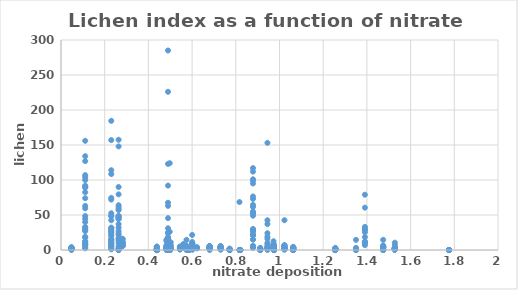
| Category | Lichen index as a function of sulfate deposition |
|---|---|
| 0.282 | 10 |
| 0.282 | 8 |
| 0.282 | 9.5 |
| 0.282 | 15.5 |
| 0.282 | 16 |
| 0.282 | 9 |
| 0.282 | 6 |
| 0.282 | 5.5 |
| 0.282 | 6.5 |
| 0.282 | 6 |
| 0.282 | 12.5 |
| 0.282 | 11 |
| 0.11075 | 30 |
| 0.11075 | 134 |
| 0.11075 | 156 |
| 0.11075 | 5 |
| 0.11075 | 32 |
| 0.11075 | 100 |
| 0.11075 | 107 |
| 0.11075 | 59.5 |
| 0.11075 | 92 |
| 0.11075 | 17.5 |
| 0.11075 | 63 |
| 0.11075 | 104 |
| 0.11075 | 44.5 |
| 0.11075 | 8.5 |
| 0.11075 | 48.5 |
| 0.11075 | 9.5 |
| 0.11075 | 12.5 |
| 0.11075 | 8 |
| 0.11075 | 89 |
| 0.11075 | 12 |
| 0.11075 | 82.5 |
| 0.11075 | 74 |
| 0.11075 | 40 |
| 0.11075 | 7.5 |
| 0.11075 | 19 |
| 0.11075 | 27 |
| 0.11075 | 2.5 |
| 0.11075 | 33 |
| 0.11075 | 3 |
| 0.11075 | 90 |
| 0.11075 | 28 |
| 0.11075 | 90.5 |
| 0.11075 | 127 |
| 0.4977 | 10 |
| 0.4977 | 3.5 |
| 0.4977 | 5 |
| 0.4977 | 0 |
| 0.4977 | 1 |
| 0.4977 | 10.5 |
| 0.4977 | 5.5 |
| 0.4977 | 124 |
| 0.4977 | 3 |
| 0.4977 | 3 |
| 0.4977 | 0 |
| 0.4977 | 26 |
| 0.4977 | 1.5 |
| 0.4977 | 1.5 |
| 0.0478 | 1.5 |
| 0.0478 | 3.5 |
| 0.0478 | 1 |
| 0.0478 | 3 |
| 0.0478 | 0.5 |
| 0.0478 | 0.5 |
| 0.0478 | 3 |
| 0.0478 | 3 |
| 0.0478 | 4 |
| 0.0478 | 2 |
| 0.0478 | 1.5 |
| 0.0478 | 1.5 |
| 0.0478 | 2.5 |
| 0.0478 | 3 |
| 0.0478 | 0.5 |
| 0.0478 | 2.5 |
| 0.0478 | 3 |
| 0.23 | 32 |
| 0.23 | 11 |
| 0.23 | 6 |
| 0.23 | 28 |
| 0.23 | 13 |
| 0.23 | 5 |
| 0.23 | 20 |
| 0.23 | 31 |
| 0.23 | 25 |
| 0.23 | 27 |
| 0.23 | 1 |
| 0.23 | 3.5 |
| 0.23 | 8 |
| 0.23 | 48 |
| 0.23 | 31 |
| 0.23 | 72 |
| 0.23 | 157 |
| 0.23 | 21.5 |
| 0.23 | 15 |
| 0.23 | 49 |
| 0.23 | 42.5 |
| 0.23 | 184.5 |
| 0.23 | 2 |
| 0.23 | 14 |
| 0.23 | 74.5 |
| 0.23 | 10.5 |
| 0.23 | 16 |
| 0.23 | 52.5 |
| 0.23 | 108.5 |
| 0.23 | 7 |
| 0.23 | 8.5 |
| 0.23 | 24.5 |
| 0.23 | 114 |
| 0.5024 | 3 |
| 0.5024 | 2.5 |
| 0.5024 | 2.5 |
| 0.5024 | 3.5 |
| 0.5024 | 11 |
| 0.5024 | 3 |
| 0.5024 | 6.5 |
| 0.73042 | 3 |
| 0.73042 | 3.5 |
| 0.73042 | 3 |
| 0.73042 | 2.5 |
| 0.73042 | 3 |
| 0.73042 | 3.5 |
| 0.73042 | 3 |
| 0.73042 | 3 |
| 0.73042 | 3 |
| 0.73042 | 3.5 |
| 0.73042 | 5.5 |
| 0.73042 | 2.5 |
| 0.73042 | 0.5 |
| 0.73042 | 4.5 |
| 0.73042 | 5.5 |
| 0.73042 | 2 |
| 0.73042 | 1 |
| 0.73042 | 3 |
| 0.58375 | 0 |
| 0.58375 | 0 |
| 0.58375 | 0 |
| 0.58375 | 0 |
| 0.58375 | 0 |
| 0.58375 | 0 |
| 0.58375 | 0 |
| 0.58375 | 0 |
| 0.58375 | 0 |
| 0.58375 | 0 |
| 0.58375 | 0 |
| 0.58375 | 0 |
| 0.58375 | 0 |
| 0.58375 | 0 |
| 0.58375 | 0 |
| 0.58375 | 0 |
| 0.58375 | 0 |
| 0.58375 | 0 |
| 0.58375 | 0 |
| 0.58375 | 0 |
| 0.58375 | 0 |
| 0.58375 | 0 |
| 0.58375 | 0 |
| 0.58375 | 0 |
| 0.58375 | 0 |
| 0.58375 | 0 |
| 0.58375 | 0 |
| 0.58375 | 0 |
| 0.58375 | 0 |
| 0.58375 | 0 |
| 0.58375 | 0 |
| 0.58375 | 0 |
| 0.58375 | 0.5 |
| 0.6017 | 2 |
| 0.6017 | 3 |
| 0.6017 | 2.5 |
| 0.6017 | 2.5 |
| 0.6017 | 3 |
| 0.6017 | 6 |
| 0.6017 | 3 |
| 0.6017 | 0.5 |
| 0.6017 | 2 |
| 0.6017 | 3 |
| 0.6017 | 4 |
| 0.6017 | 1.5 |
| 0.6017 | 5 |
| 0.6017 | 1.5 |
| 0.6017 | 3 |
| 0.6017 | 4 |
| 0.6017 | 3.5 |
| 0.6017 | 7 |
| 0.6017 | 2 |
| 0.6017 | 2.5 |
| 0.6017 | 2 |
| 0.6017 | 1 |
| 0.6017 | 3.5 |
| 0.6017 | 5 |
| 0.6017 | 2 |
| 0.6017 | 6 |
| 0.6017 | 9.5 |
| 0.4882 | 2 |
| 0.4882 | 4 |
| 0.4882 | 1.5 |
| 0.4882 | 1.5 |
| 0.4882 | 2 |
| 0.4882 | 1.5 |
| 0.4882 | 2.5 |
| 0.4882 | 3 |
| 0.4882 | 1.5 |
| 0.4882 | 2.5 |
| 0.4882 | 4 |
| 0.4882 | 2.5 |
| 0.4882 | 1.5 |
| 0.4882 | 2.5 |
| 0.4882 | 1.5 |
| 0.4882 | 4 |
| 0.4882 | 1.5 |
| 0.4882 | 0.5 |
| 0.4882 | 1.5 |
| 0.4882 | 3 |
| 0.4882 | 2.5 |
| 0.4882 | 2.5 |
| 0.4882 | 3 |
| 0.4882 | 1.5 |
| 0.4882 | 3 |
| 0.4882 | 0 |
| 0.4882 | 2 |
| 0.4882 | 1.5 |
| 0.4882 | 2.5 |
| 0.4882 | 2 |
| 0.4882 | 2 |
| 0.4882 | 1.5 |
| 0.4882 | 6.5 |
| 0.6224 | 3 |
| 0.6224 | 2.5 |
| 0.6224 | 2.5 |
| 0.6224 | 3 |
| 0.6224 | 3.5 |
| 0.6224 | 3 |
| 0.6224 | 3 |
| 0.6224 | 4 |
| 0.56 | 4.5 |
| 0.56 | 3.5 |
| 0.56 | 3.5 |
| 0.56 | 7 |
| 0.56 | 4.5 |
| 0.56 | 3 |
| 0.56 | 3 |
| 0.56 | 3.5 |
| 0.56 | 5 |
| 0.56 | 8.5 |
| 0.56 | 3 |
| 0.56 | 4 |
| 0.56 | 4 |
| 0.8787 | 73 |
| 0.8787 | 95 |
| 0.8787 | 29 |
| 0.8787 | 99 |
| 0.8787 | 117 |
| 0.8787 | 27 |
| 0.8787 | 55 |
| 0.8787 | 6 |
| 0.8787 | 21 |
| 0.8787 | 112 |
| 0.8787 | 29 |
| 0.8787 | 50.5 |
| 0.8787 | 64.5 |
| 0.8787 | 53 |
| 0.8787 | 76.5 |
| 0.8787 | 53.5 |
| 0.8787 | 15 |
| 0.8787 | 30 |
| 0.8787 | 101 |
| 0.8787 | 23 |
| 0.8787 | 27 |
| 0.8787 | 15 |
| 0.8787 | 61.5 |
| 0.8787 | 49 |
| 0.8787 | 29 |
| 0.8787 | 20.5 |
| 0.8787 | 3 |
| 0.8787 | 5 |
| 0.8787 | 5 |
| 0.94475 | 0 |
| 0.94475 | 37 |
| 0.94475 | 2 |
| 0.94475 | 8 |
| 0.94475 | 3 |
| 0.94475 | 2.5 |
| 0.94475 | 4 |
| 0.94475 | 42.5 |
| 0.94475 | 19 |
| 0.94475 | 4 |
| 0.94475 | 5.5 |
| 0.94475 | 16 |
| 0.94475 | 153 |
| 0.94475 | 24 |
| 0.94475 | 10 |
| 0.6002 | 5.5 |
| 0.6002 | 7 |
| 0.6002 | 3.5 |
| 0.6002 | 4 |
| 0.6002 | 4 |
| 0.6002 | 5.5 |
| 0.6002 | 21.5 |
| 0.6002 | 3 |
| 0.6002 | 6 |
| 0.6002 | 4.5 |
| 0.6002 | 9 |
| 0.6002 | 3 |
| 0.6002 | 2.5 |
| 0.6002 | 11.5 |
| 0.6002 | 6.5 |
| 0.6002 | 2.5 |
| 0.6002 | 4 |
| 0.6002 | 3 |
| 0.6002 | 4 |
| 0.6002 | 3 |
| 0.6002 | 4.5 |
| 0.972667 | 4 |
| 0.972667 | 3.5 |
| 0.972667 | 4.5 |
| 0.972667 | 2 |
| 0.972667 | 2 |
| 0.972667 | 3 |
| 0.972667 | 3.5 |
| 0.972667 | 1.5 |
| 0.972667 | 8 |
| 0.972667 | 1.5 |
| 0.972667 | 1.5 |
| 0.972667 | 3.5 |
| 0.972667 | 12.5 |
| 0.972667 | 3 |
| 0.972667 | 6.5 |
| 0.972667 | 3 |
| 0.972667 | 4.5 |
| 0.972667 | 6.5 |
| 0.972667 | 1 |
| 0.972667 | 5 |
| 0.972667 | 2 |
| 0.972667 | 3 |
| 0.972667 | 2.5 |
| 0.972667 | 3 |
| 0.972667 | 2.5 |
| 0.972667 | 2.5 |
| 0.972667 | 3.5 |
| 0.972667 | 3.5 |
| 0.972667 | 1 |
| 0.972667 | 3 |
| 0.7717 | 0 |
| 0.7717 | 0.5 |
| 0.7717 | 1 |
| 0.7717 | 0 |
| 0.7717 | 0 |
| 0.7717 | 0 |
| 0.7717 | 1.5 |
| 0.7717 | 2 |
| 0.7717 | 0 |
| 0.7717 | 0 |
| 0.7717 | 0.5 |
| 0.7717 | 0 |
| 0.7717 | 0 |
| 0.7717 | 1.5 |
| 0.7717 | 0 |
| 0.7717 | 0 |
| 0.57418 | 0 |
| 0.57418 | 1.5 |
| 0.57418 | 0.5 |
| 0.57418 | 2 |
| 0.57418 | 2.5 |
| 0.57418 | 1.5 |
| 0.57418 | 6.5 |
| 0.57418 | 14.5 |
| 0.57418 | 4 |
| 0.57418 | 3 |
| 0.5004 | 1 |
| 0.5004 | 3 |
| 0.5004 | 3 |
| 0.5004 | 2 |
| 0.5004 | 2.5 |
| 0.5004 | 1.5 |
| 0.5004 | 1.5 |
| 0.5004 | 1.5 |
| 0.5004 | 3 |
| 0.5004 | 7.5 |
| 0.5004 | 2 |
| 0.5004 | 1.5 |
| 0.5004 | 2.5 |
| 0.5004 | 3.5 |
| 0.5004 | 2 |
| 0.5004 | 0 |
| 0.5004 | 2.5 |
| 0.5004 | 2 |
| 0.5004 | 2 |
| 0.5004 | 2.5 |
| 0.5004 | 2 |
| 0.5004 | 1 |
| 0.5004 | 2 |
| 0.5004 | 2.5 |
| 0.5004 | 2 |
| 0.5004 | 1.5 |
| 0.5004 | 2.5 |
| 0.5004 | 1.5 |
| 0.5004 | 1.5 |
| 0.5004 | 1.5 |
| 0.5004 | 4 |
| 0.5004 | 2 |
| 0.5004 | 3 |
| 0.4898 | 8 |
| 0.4898 | 4.5 |
| 0.4898 | 18.5 |
| 0.4898 | 67.5 |
| 0.4898 | 5 |
| 0.4898 | 226 |
| 0.4898 | 5 |
| 0.4898 | 3.5 |
| 0.4898 | 3 |
| 0.4898 | 1.5 |
| 0.4898 | 16 |
| 0.4898 | 8 |
| 0.4898 | 9 |
| 0.4898 | 16.5 |
| 0.4898 | 2.5 |
| 0.4898 | 31 |
| 0.4898 | 4 |
| 0.4898 | 12.5 |
| 0.4898 | 123 |
| 0.4898 | 63 |
| 0.4898 | 4 |
| 0.4898 | 10 |
| 0.4898 | 24 |
| 0.4898 | 15.5 |
| 0.4898 | 3 |
| 0.4898 | 10.5 |
| 0.4898 | 3.5 |
| 0.4898 | 11.5 |
| 0.4898 | 45.5 |
| 0.4898 | 285 |
| 0.4898 | 25 |
| 0.4898 | 16.5 |
| 0.4898 | 92 |
| 0.5446 | 1.5 |
| 0.5446 | 3.5 |
| 0.5446 | 1 |
| 0.5446 | 3 |
| 0.5446 | 3.5 |
| 0.5446 | 2.5 |
| 0.5446 | 2 |
| 0.5446 | 4 |
| 0.5446 | 3 |
| 0.5446 | 2 |
| 0.5446 | 1 |
| 0.5446 | 2 |
| 0.5446 | 5 |
| 0.5446 | 3.5 |
| 0.5446 | 1 |
| 0.5446 | 1 |
| 0.5446 | 2.5 |
| 0.5446 | 4 |
| 0.5446 | 1.5 |
| 0.5446 | 4 |
| 0.5446 | 4.5 |
| 0.5446 | 4 |
| 0.4832 | 5.5 |
| 0.4832 | 2 |
| 0.4832 | 5 |
| 0.4832 | 3 |
| 0.4832 | 4.5 |
| 0.4832 | 1 |
| 0.4832 | 1.5 |
| 0.4832 | 3 |
| 0.4832 | 4 |
| 0.4832 | 12.5 |
| 0.4832 | 6 |
| 0.4832 | 3 |
| 0.4832 | 1.5 |
| 0.4832 | 5 |
| 0.4832 | 7 |
| 0.4832 | 15 |
| 0.4832 | 0.5 |
| 0.4832 | 2 |
| 0.4832 | 3 |
| 0.4832 | 14 |
| 0.4832 | 3.5 |
| 0.4832 | 0.5 |
| 0.4832 | 0 |
| 0.821 | 0 |
| 0.821 | 0 |
| 0.821 | 0 |
| 0.821 | 0 |
| 0.821 | 0 |
| 0.821 | 0 |
| 0.821 | 0 |
| 0.821 | 0 |
| 0.821 | 0 |
| 0.821 | 0 |
| 0.821 | 0 |
| 0.821 | 0 |
| 0.821 | 0 |
| 0.9116 | 1.5 |
| 0.9116 | 1 |
| 0.9116 | 1 |
| 0.9116 | 1.5 |
| 0.9116 | 0 |
| 0.9116 | 1 |
| 0.9116 | 0.5 |
| 0.9116 | 0 |
| 0.9116 | 0 |
| 0.9116 | 0.5 |
| 0.9116 | 2 |
| 0.9116 | 0.5 |
| 0.9116 | 1.5 |
| 0.9116 | 1.5 |
| 0.9116 | 2.5 |
| 0.9116 | 0.5 |
| 0.9116 | 0.5 |
| 0.9116 | 3 |
| 0.9116 | 2.5 |
| 0.8169 | 0 |
| 0.8169 | 0 |
| 0.8169 | 0 |
| 0.8169 | 0 |
| 0.8169 | 68.5 |
| 0.8169 | 0 |
| 0.8169 | 0 |
| 0.8169 | 0 |
| 0.8169 | 0 |
| 0.8169 | 0 |
| 0.8169 | 0 |
| 0.8169 | 0 |
| 0.8169 | 0 |
| 1.0227 | 7 |
| 1.0227 | 42.5 |
| 1.0227 | 2.5 |
| 1.0227 | 6.5 |
| 1.0227 | 3.5 |
| 1.0227 | 2.5 |
| 1.0227 | 6 |
| 1.0227 | 3.5 |
| 1.0227 | 5 |
| 1.0227 | 1 |
| 1.0227 | 1 |
| 1.0227 | 4 |
| 1.0227 | 2 |
| 1.0227 | 3 |
| 1.0227 | 1.5 |
| 1.0227 | 0.5 |
| 1.0227 | 4 |
| 1.0227 | 2.5 |
| 1.0626 | 3 |
| 1.0626 | 3 |
| 1.0626 | 3 |
| 1.0626 | 2 |
| 1.0626 | 1.5 |
| 1.0626 | 4 |
| 1.0626 | 1.5 |
| 1.0626 | 1 |
| 1.0626 | 4.5 |
| 1.0626 | 3 |
| 1.0626 | 3 |
| 1.0626 | 2.5 |
| 1.0626 | 1 |
| 1.0626 | 2 |
| 1.0626 | 1.5 |
| 1.0626 | 0 |
| 1.0626 | 2.5 |
| 1.0626 | 3 |
| 1.0626 | 2.5 |
| 1.0626 | 3.5 |
| 1.0626 | 0 |
| 1.0626 | 0 |
| 1.0626 | 0 |
| 1.0626 | 0 |
| 1.0626 | 0 |
| 1.0626 | 0 |
| 1.0626 | 3.5 |
| 1.0626 | 2.5 |
| 1.0626 | 1.5 |
| 1.3909 | 10.5 |
| 1.3909 | 7 |
| 1.3909 | 18.5 |
| 1.3909 | 30 |
| 1.3909 | 11.5 |
| 1.3909 | 28.5 |
| 1.3909 | 79 |
| 1.3909 | 60.5 |
| 1.3909 | 33 |
| 1.3909 | 9.5 |
| 1.3909 | 12 |
| 1.3909 | 25.5 |
| 1.77589 | 0 |
| 1.77589 | 0 |
| 1.77589 | 0 |
| 1.77589 | 0 |
| 1.77589 | 0 |
| 1.77589 | 0 |
| 1.77589 | 0 |
| 1.77589 | 0 |
| 1.775889 | 0 |
| 1.2553 | 0.5 |
| 1.2553 | 0.5 |
| 1.2553 | 1 |
| 1.2553 | 0 |
| 1.2553 | 0 |
| 1.2553 | 0 |
| 1.2553 | 2 |
| 1.2553 | 0 |
| 1.2553 | 0 |
| 1.2553 | 0 |
| 1.2553 | 1 |
| 1.2553 | 1 |
| 1.2553 | 1.5 |
| 1.2553 | 0 |
| 1.2553 | 1.5 |
| 1.2553 | 1 |
| 1.2553 | 1.5 |
| 1.2553 | 0 |
| 1.2553 | 1.5 |
| 1.2553 | 3 |
| 1.2553 | 0.5 |
| 1.2553 | 1.5 |
| 1.2553 | 2.5 |
| 1.2553 | 1.5 |
| 1.2553 | 0 |
| 0.4385 | 2 |
| 0.4385 | 0 |
| 0.4385 | 0 |
| 0.4385 | 0 |
| 0.4385 | 0.5 |
| 0.4385 | 3 |
| 0.4385 | 0 |
| 0.4385 | 0 |
| 0.4385 | 4.56 |
| 0.4385 | 0 |
| 0.4385 | 0 |
| 0.4385 | 0 |
| 0.4385 | 0 |
| 0.4385 | 0 |
| 0.4385 | 0 |
| 0.4385 | 0 |
| 0.4385 | 0 |
| 0.4385 | 2 |
| 0.4385 | 1 |
| 0.4385 | 0 |
| 0.4385 | 5 |
| 0.4385 | 1.5 |
| 0.4385 | 0 |
| 0.4385 | 0 |
| 0.4385 | 0 |
| 0.4385 | 0 |
| 0.4385 | 0 |
| 1.4744 | 0 |
| 1.4744 | 0 |
| 1.4744 | 4.5 |
| 1.4744 | 4 |
| 1.4744 | 3.5 |
| 1.4744 | 1 |
| 1.4744 | 5 |
| 1.4744 | 4.5 |
| 1.4744 | 0 |
| 1.4744 | 3 |
| 1.4744 | 0.5 |
| 1.4744 | 6.5 |
| 1.4744 | 0.5 |
| 1.4744 | 4.5 |
| 1.4744 | 5.5 |
| 1.4744 | 3 |
| 1.4744 | 5 |
| 1.4744 | 3 |
| 1.4744 | 14.5 |
| 1.4744 | 3.5 |
| 1.4744 | 0 |
| 1.4744 | 0.5 |
| 1.5279 | 2.5 |
| 1.5279 | 1 |
| 1.5279 | 2 |
| 1.5279 | 2 |
| 1.5279 | 3 |
| 1.5279 | 2 |
| 1.5279 | 0.5 |
| 1.5279 | 1.5 |
| 1.5279 | 2.5 |
| 1.5279 | 1 |
| 1.5279 | 2.5 |
| 1.5279 | 3 |
| 1.5279 | 2 |
| 1.5279 | 0.5 |
| 1.5279 | 7 |
| 1.5279 | 1 |
| 1.5279 | 2 |
| 1.5279 | 2 |
| 1.5279 | 3 |
| 1.5279 | 1 |
| 1.5279 | 3 |
| 1.5279 | 0.5 |
| 1.5279 | 1.5 |
| 1.5279 | 0.5 |
| 1.5279 | 3 |
| 1.5279 | 0.5 |
| 1.5279 | 3 |
| 1.5279 | 1 |
| 1.5279 | 1 |
| 1.5279 | 2 |
| 1.5279 | 2 |
| 1.5279 | 10.5 |
| 1.5279 | 2.5 |
| 0.2636 | 5.5 |
| 0.2636 | 90 |
| 0.2636 | 0 |
| 0.2636 | 148 |
| 0.2636 | 57 |
| 0.2636 | 2 |
| 0.2636 | 47.5 |
| 0.2636 | 27 |
| 0.2636 | 79.5 |
| 0.2636 | 17 |
| 0.2636 | 48 |
| 0.2636 | 157.5 |
| 0.2636 | 61.5 |
| 0.2636 | 15.5 |
| 0.2636 | 23.5 |
| 0.2636 | 0 |
| 0.2636 | 32 |
| 0.2636 | 0 |
| 0.2636 | 0 |
| 0.2636 | 2.5 |
| 0.2636 | 58.5 |
| 0.2636 | 10 |
| 0.2636 | 49 |
| 0.2636 | 0 |
| 0.2636 | 0 |
| 0.2636 | 37 |
| 0.2636 | 13 |
| 0.2636 | 64 |
| 0.2636 | 44 |
| 0.2636 | 46 |
| 0.2636 | 45 |
| 0.2636 | 21.5 |
| 1.3502 | 0.5 |
| 1.3502 | 3 |
| 1.3502 | 2.5 |
| 1.3502 | 1.5 |
| 1.3502 | 2 |
| 1.3502 | 0 |
| 1.3502 | 0 |
| 1.3502 | 14.5 |
| 1.3502 | 0.5 |
| 0.9745 | 0.5 |
| 0.9745 | 0.5 |
| 0.9745 | 7.5 |
| 0.9745 | 0 |
| 0.9745 | 1 |
| 0.9745 | 0.5 |
| 0.9745 | 2.5 |
| 0.9745 | 0 |
| 0.9745 | 0 |
| 0.9745 | 3 |
| 0.9745 | 1 |
| 0.9745 | 0 |
| 0.9745 | 1 |
| 0.9745 | 1 |
| 0.9745 | 0 |
| 0.9745 | 0.5 |
| 0.9745 | 0 |
| 0.9745 | 3 |
| 0.9745 | 0 |
| 0.9745 | 2 |
| 0.9745 | 0 |
| 0.9745 | 0 |
| 0.9745 | 4.5 |
| 0.9745 | 3 |
| 0.9745 | 2.5 |
| 0.9745 | 3 |
| 0.9745 | 6.5 |
| 0.9745 | 2.5 |
| 0.9745 | 2.5 |
| 0.9745 | 0.5 |
| 0.9745 | 1 |
| 0.9745 | 2.5 |
| 0.9745 | 2 |
| 0.6803 | 3 |
| 0.6803 | 3 |
| 0.6803 | 3 |
| 0.6803 | 3 |
| 0.6803 | 3 |
| 0.6803 | 2 |
| 0.6803 | 5.5 |
| 0.6803 | 3 |
| 0.6803 | 2.5 |
| 0.6803 | 5 |
| 0.6803 | 4.5 |
| 0.6803 | 3 |
| 0.6803 | 4.5 |
| 0.6803 | 3 |
| 0.6803 | 2 |
| 0.6803 | 5.5 |
| 0.6803 | 2.5 |
| 0.6803 | 0 |
| 0.6803 | 3.5 |
| 0.6803 | 2.5 |
| 0.6803 | 4.5 |
| 0.6803 | 5.5 |
| 0.6803 | 2 |
| 0.6803 | 3 |
| 0.6803 | 3 |
| 0.6803 | 3 |
| 0.6803 | 3 |
| 0.6803 | 3 |